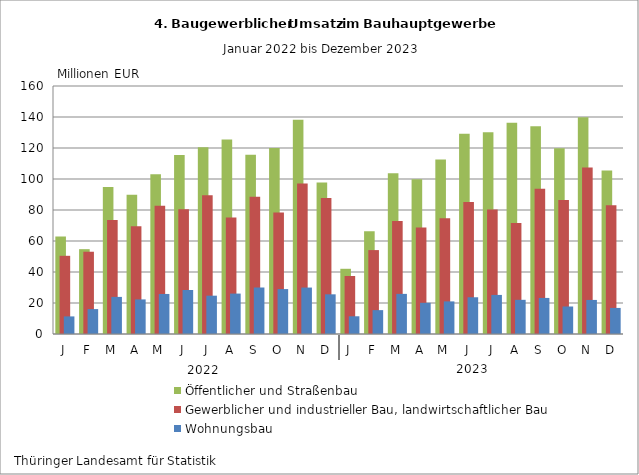
| Category | Öffentlicher und Straßenbau | Gewerblicher und industrieller Bau, landwirtschaftlicher Bau | Wohnungsbau |
|---|---|---|---|
| J | 62.855 | 50.447 | 11.346 |
| F | 54.729 | 53.076 | 16.069 |
| M | 94.807 | 73.587 | 23.932 |
| A | 89.915 | 69.57 | 22.315 |
| M | 103.107 | 82.741 | 25.829 |
| J | 115.413 | 80.509 | 28.389 |
| J | 120.404 | 89.44 | 24.721 |
| A | 125.468 | 75.143 | 26.072 |
| S | 115.712 | 88.59 | 29.999 |
| O | 120.027 | 78.307 | 28.974 |
| N | 138.215 | 97.042 | 29.961 |
| D | 97.802 | 87.746 | 25.599 |
| J | 42.07 | 37.425 | 11.431 |
| F | 66.331 | 54.133 | 15.4 |
| M | 103.767 | 72.824 | 25.885 |
| A | 99.91 | 68.73 | 20.127 |
| M | 112.585 | 74.645 | 21.036 |
| J | 129.248 | 85.211 | 23.695 |
| J | 130.219 | 80.288 | 25.214 |
| A | 136.315 | 71.616 | 22.053 |
| S | 134.037 | 93.671 | 23.269 |
| O | 119.783 | 86.489 | 17.744 |
| N | 139.914 | 107.36 | 21.974 |
| D | 105.506 | 83.093 | 16.818 |